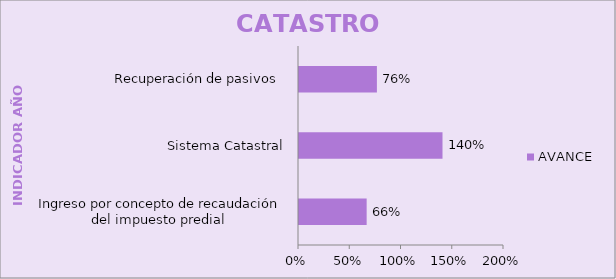
| Category | AVANCE  |
|---|---|
| Ingreso por concepto de recaudación del impuesto predial  | 0.66 |
| Sistema Catastral | 1.4 |
| Recuperación de pasivos  | 0.76 |